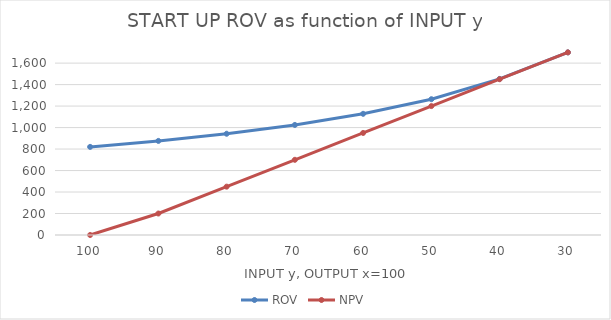
| Category | ROV | NPV |
|---|---|---|
| 100.0 | 820.024 | 0 |
| 90.0 | 875.763 | 200 |
| 80.0 | 942.571 | 450 |
| 70.0 | 1024.496 | 700 |
| 60.0 | 1127.966 | 950 |
| 50.0 | 1263.914 | 1200 |
| 40.0 | 1452.797 | 1450 |
| 30.0 | 1700 | 1700 |